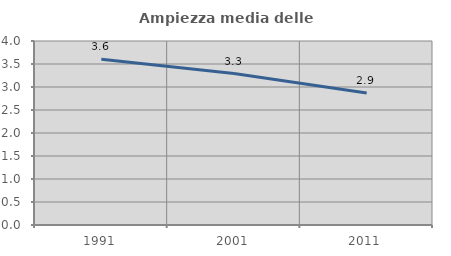
| Category | Ampiezza media delle famiglie |
|---|---|
| 1991.0 | 3.604 |
| 2001.0 | 3.291 |
| 2011.0 | 2.872 |